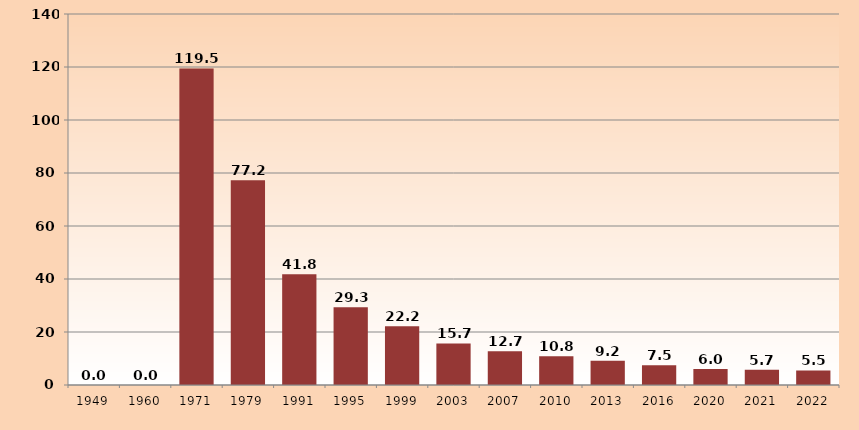
| Category | Series 1 |
|---|---|
| 1949.0 | 0 |
| 1960.0 | 0 |
| 1971.0 | 119.475 |
| 1979.0 | 77.241 |
| 1991.0 | 41.838 |
| 1995.0 | 29.3 |
| 1999.0 | 22.152 |
| 2003.0 | 15.7 |
| 2007.0 | 12.698 |
| 2010.0 | 10.834 |
| 2013.0 | 9.157 |
| 2016.0 | 7.477 |
| 2020.0 | 6.046 |
| 2021.0 | 5.712 |
| 2022.0 | 5.478 |